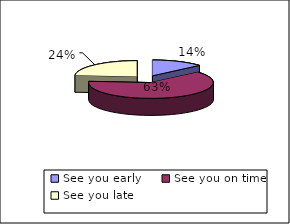
| Category | When you arrived at the surgery for your appointment did the doctor |
|---|---|
| See you early | 8 |
| See you on time | 37 |
| See you late | 14 |